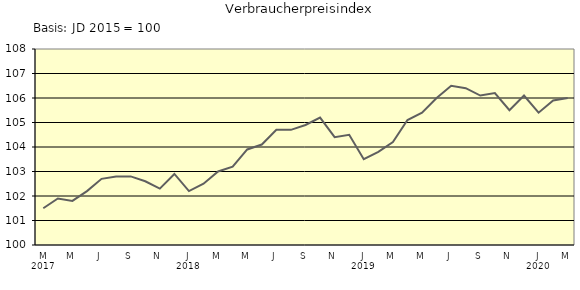
| Category | Series 0 |
|---|---|
| 0 | 101.5 |
| 1 | 101.9 |
| 2 | 101.8 |
| 3 | 102.2 |
| 4 | 102.7 |
| 5 | 102.8 |
| 6 | 102.8 |
| 7 | 102.6 |
| 8 | 102.3 |
| 9 | 102.9 |
| 10 | 102.2 |
| 11 | 102.5 |
| 12 | 103 |
| 13 | 103.2 |
| 14 | 103.9 |
| 15 | 104.1 |
| 16 | 104.7 |
| 17 | 104.7 |
| 18 | 104.9 |
| 19 | 105.2 |
| 20 | 104.4 |
| 21 | 104.5 |
| 22 | 103.5 |
| 23 | 103.8 |
| 24 | 104.2 |
| 25 | 105.1 |
| 26 | 105.4 |
| 27 | 106 |
| 28 | 106.5 |
| 29 | 106.4 |
| 30 | 106.1 |
| 31 | 106.2 |
| 32 | 105.5 |
| 33 | 106.1 |
| 34 | 105.4 |
| 35 | 105.9 |
| 36 | 106 |